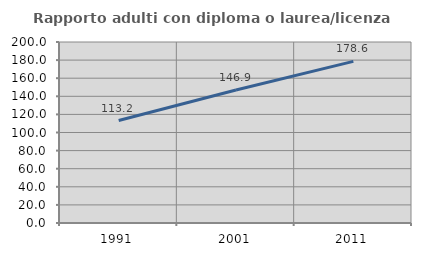
| Category | Rapporto adulti con diploma o laurea/licenza media  |
|---|---|
| 1991.0 | 113.18 |
| 2001.0 | 146.905 |
| 2011.0 | 178.581 |